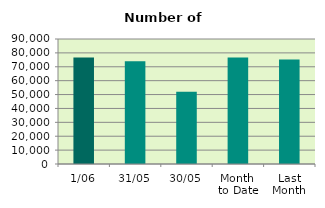
| Category | Series 0 |
|---|---|
| 1/06 | 76750 |
| 31/05 | 74058 |
| 30/05 | 52074 |
| Month 
to Date | 76750 |
| Last
Month | 75261.143 |